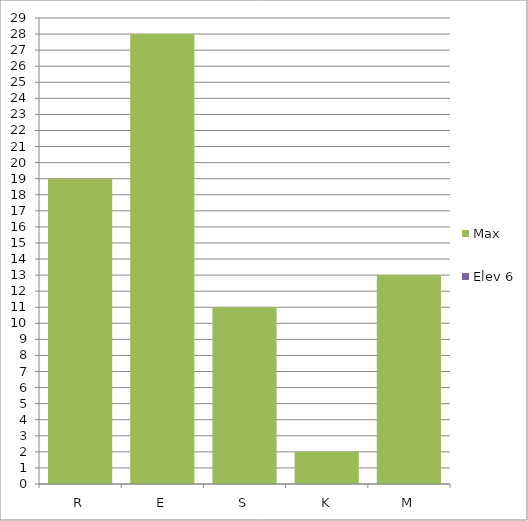
| Category | Max | Elev 6 |
|---|---|---|
| R | 19 | 0 |
| E | 28 | 0 |
| S | 11 | 0 |
| K | 2 | 0 |
| M | 13 | 0 |